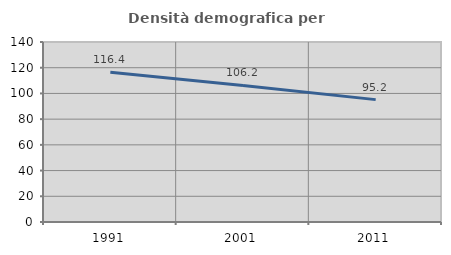
| Category | Densità demografica |
|---|---|
| 1991.0 | 116.409 |
| 2001.0 | 106.173 |
| 2011.0 | 95.174 |